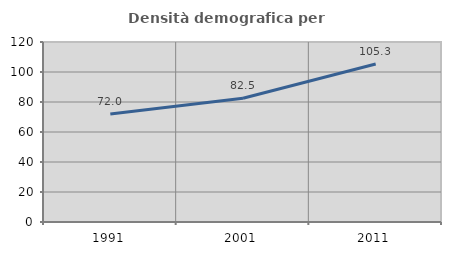
| Category | Densità demografica |
|---|---|
| 1991.0 | 71.966 |
| 2001.0 | 82.479 |
| 2011.0 | 105.287 |